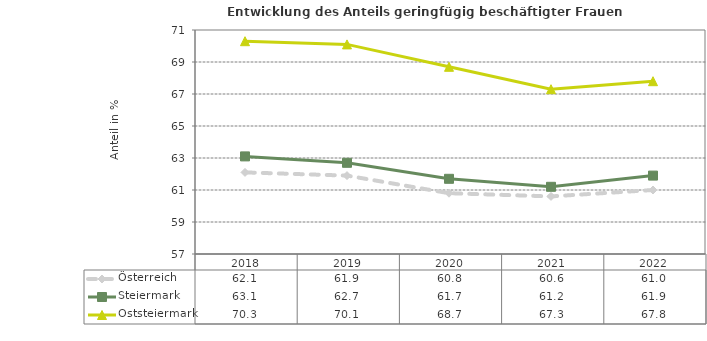
| Category | Österreich | Steiermark | Oststeiermark |
|---|---|---|---|
| 2022.0 | 61 | 61.9 | 67.8 |
| 2021.0 | 60.6 | 61.2 | 67.3 |
| 2020.0 | 60.8 | 61.7 | 68.7 |
| 2019.0 | 61.9 | 62.7 | 70.1 |
| 2018.0 | 62.1 | 63.1 | 70.3 |